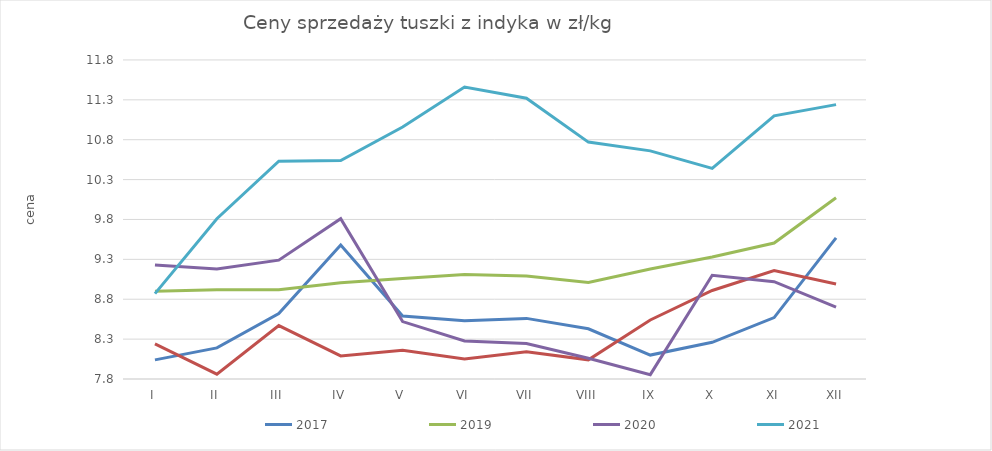
| Category | 2017 | 2018 | 2019 | 2020 | 2021 |
|---|---|---|---|---|---|
| I | 8.04 | 8.24 | 8.9 | 9.23 | 8.87 |
| II | 8.19 | 7.86 | 8.92 | 9.18 | 9.81 |
| III | 8.62 | 8.47 | 8.92 | 9.29 | 10.53 |
| IV | 9.48 | 8.09 | 9.007 | 9.81 | 10.54 |
| V | 8.59 | 8.161 | 9.06 | 8.52 | 10.96 |
| VI | 8.53 | 8.05 | 9.11 | 8.276 | 11.46 |
| VII | 8.56 | 8.14 | 9.09 | 8.246 | 11.32 |
| VIII | 8.43 | 8.04 | 9.01 | 8.06 | 10.77 |
| IX | 8.1 | 8.54 | 9.18 | 7.854 | 10.66 |
| X | 8.26 | 8.91 | 9.33 | 9.1 | 10.44 |
| XI | 8.57 | 9.16 | 9.505 | 9.02 | 11.1 |
| XII | 9.57 | 8.99 | 10.072 | 8.7 | 11.24 |